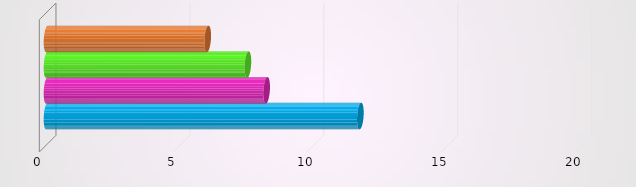
| Category | Strukturalne | Profesjonalizacja | Partnerstwo | Pedagogiczne |
|---|---|---|---|---|
| 0 | 6 | 7.5 | 8.2 | 11.7 |